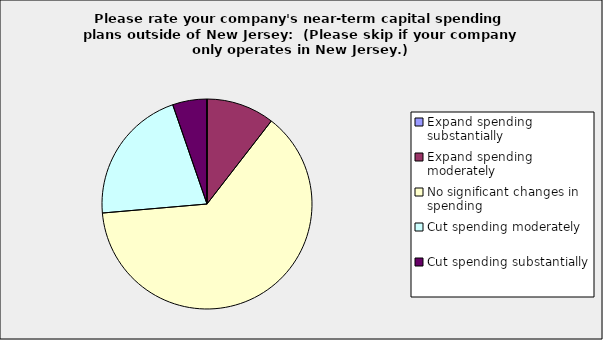
| Category | Series 0 |
|---|---|
| Expand spending substantially | 0 |
| Expand spending moderately | 0.105 |
| No significant changes in spending | 0.632 |
| Cut spending moderately | 0.211 |
| Cut spending substantially | 0.053 |